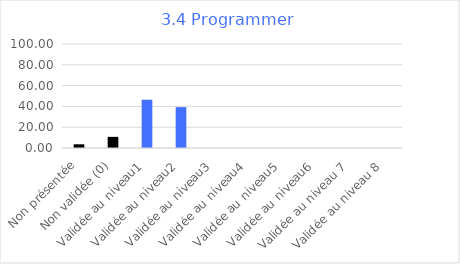
| Category | Series 0 |
|---|---|
| Non présentée | 3.571 |
| Non validée (0) | 10.714 |
| Validée au niveau1 | 46.429 |
| Validée au niveau2 | 39.286 |
| Validée au niveau3 | 0 |
| Validée au niveau4 | 0 |
| Validée au niveau5 | 0 |
| Validée au niveau6 | 0 |
| Validée au niveau 7 | 0 |
| Validée au niveau 8 | 0 |